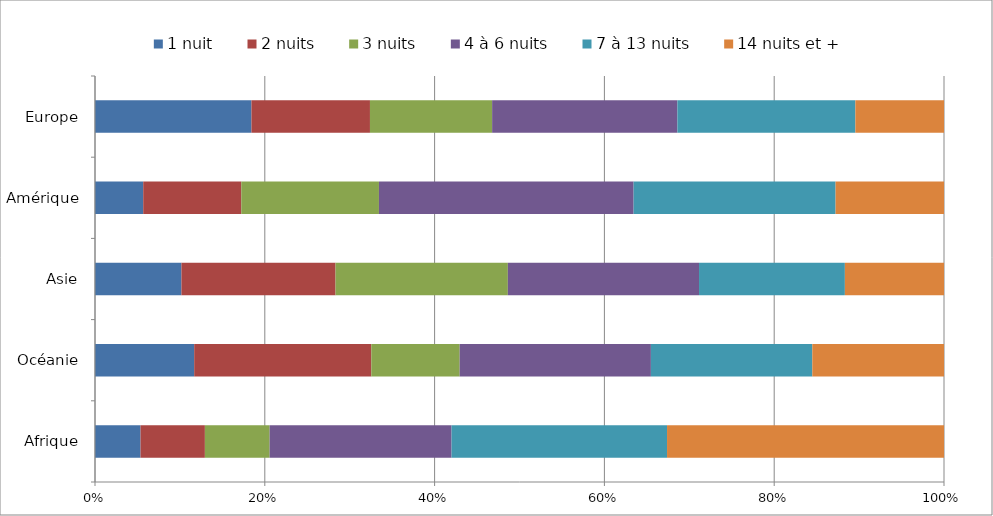
| Category | 1 nuit | 2 nuits | 3 nuits | 4 à 6 nuits | 7 à 13 nuits | 14 nuits et + |
|---|---|---|---|---|---|---|
| Afrique | 5.362 | 7.582 | 7.626 | 21.427 | 25.38 | 32.623 |
| Océanie | 11.683 | 20.86 | 10.412 | 22.522 | 19.012 | 15.511 |
| Asie | 10.179 | 18.153 | 20.298 | 22.516 | 17.18 | 11.674 |
| Amérique | 5.679 | 11.549 | 16.218 | 29.994 | 23.788 | 12.771 |
| Europe | 18.426 | 13.961 | 14.389 | 21.824 | 20.961 | 10.439 |